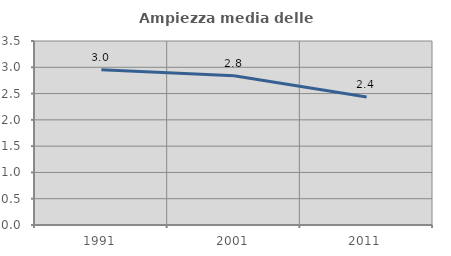
| Category | Ampiezza media delle famiglie |
|---|---|
| 1991.0 | 2.955 |
| 2001.0 | 2.838 |
| 2011.0 | 2.434 |